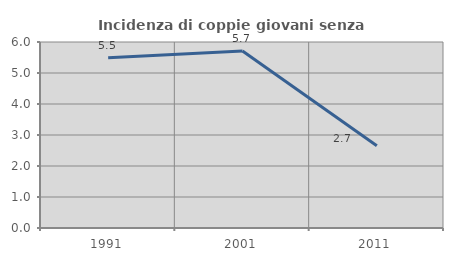
| Category | Incidenza di coppie giovani senza figli |
|---|---|
| 1991.0 | 5.495 |
| 2001.0 | 5.707 |
| 2011.0 | 2.653 |